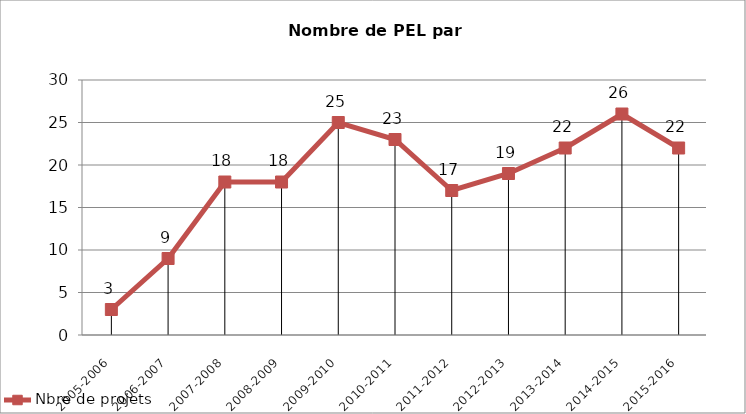
| Category | Nbre de projets |
|---|---|
| 2005-2006 | 3 |
| 2006-2007 | 9 |
| 2007-2008 | 18 |
| 2008-2009 | 18 |
| 2009-2010 | 25 |
| 2010-2011 | 23 |
| 2011-2012 | 17 |
| 2012-2013 | 19 |
| 2013-2014 | 22 |
| 2014-2015 | 26 |
| 2015-2016 | 22 |